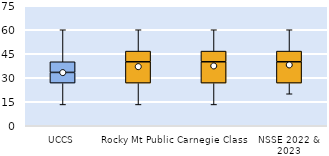
| Category | 25th | 50th | 75th |
|---|---|---|---|
| UCCS | 26.667 | 6.667 | 6.667 |
| Rocky Mt Public | 26.667 | 13.333 | 6.667 |
| Carnegie Class | 26.667 | 13.333 | 6.667 |
| NSSE 2022 & 2023 | 26.667 | 13.333 | 6.667 |